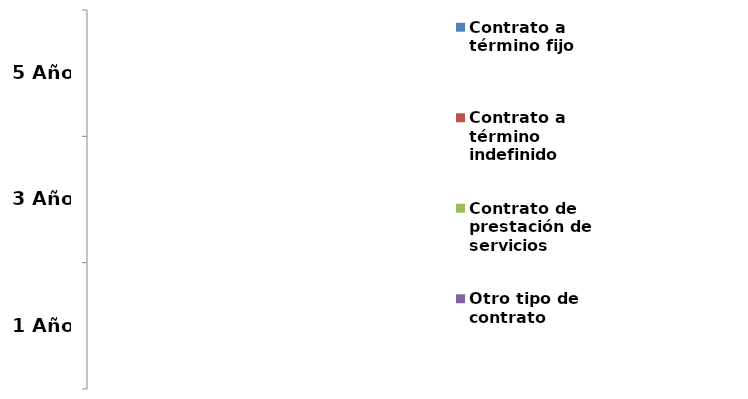
| Category | Contrato a término fijo | Contrato a término indefinido | Contrato de prestación de servicios | Otro tipo de contrato |
|---|---|---|---|---|
| 1 Año | 0 | 0 | 0 | 0 |
| 3 Año | 0 | 0 | 0 | 0 |
| 5 Año | 0 | 0 | 0 | 0 |